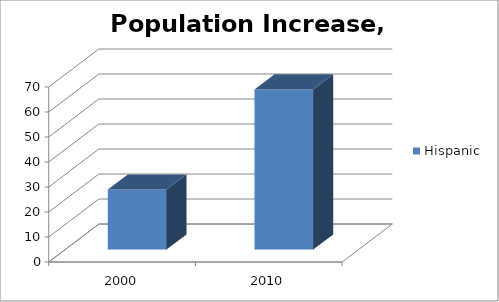
| Category | Hispanic |
|---|---|
| 2000.0 | 24 |
| 2010.0 | 64 |